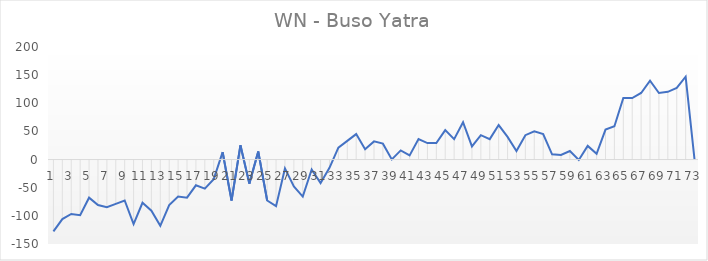
| Category | Series 0 |
|---|---|
| 0 | -127.708 |
| 1 | -105.708 |
| 2 | -96.708 |
| 3 | -98.708 |
| 4 | -67.708 |
| 5 | -80.708 |
| 6 | -84.708 |
| 7 | -78.708 |
| 8 | -72.708 |
| 9 | -114.708 |
| 10 | -76.708 |
| 11 | -90.708 |
| 12 | -117.708 |
| 13 | -80.708 |
| 14 | -65.708 |
| 15 | -67.708 |
| 16 | -45.708 |
| 17 | -51.708 |
| 18 | -34.708 |
| 19 | 13.292 |
| 20 | -72.708 |
| 21 | 25.292 |
| 22 | -42.708 |
| 23 | 14.292 |
| 24 | -72.708 |
| 25 | -82.708 |
| 26 | -15.708 |
| 27 | -47.708 |
| 28 | -65.708 |
| 29 | -17.708 |
| 30 | -41.708 |
| 31 | -14.708 |
| 32 | 21.292 |
| 33 | 33.292 |
| 34 | 45.292 |
| 35 | 18.292 |
| 36 | 32.292 |
| 37 | 28.292 |
| 38 | 0.292 |
| 39 | 16.292 |
| 40 | 7.292 |
| 41 | 36.292 |
| 42 | 29.292 |
| 43 | 29.292 |
| 44 | 52.292 |
| 45 | 36.292 |
| 46 | 66.292 |
| 47 | 23.292 |
| 48 | 43.292 |
| 49 | 36.292 |
| 50 | 61.292 |
| 51 | 40.292 |
| 52 | 15.292 |
| 53 | 43.292 |
| 54 | 50.292 |
| 55 | 45.292 |
| 56 | 9.292 |
| 57 | 8.292 |
| 58 | 15.292 |
| 59 | -0.708 |
| 60 | 24.292 |
| 61 | 10.292 |
| 62 | 53.292 |
| 63 | 59.292 |
| 64 | 109.292 |
| 65 | 109.292 |
| 66 | 118.292 |
| 67 | 140.292 |
| 68 | 118.292 |
| 69 | 120.292 |
| 70 | 127.292 |
| 71 | 147.292 |
| 72 | 0 |